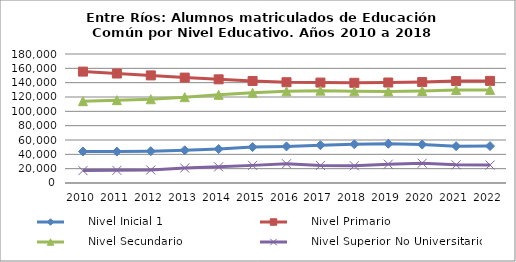
| Category |      Nivel Inicial 1 |      Nivel Primario |      Nivel Secundario |      Nivel Superior No Universitario |
|---|---|---|---|---|
| 2010.0 | 43949 | 155439 | 114175 | 17275 |
| 2011.0 | 43796 | 152764 | 115596 | 17632 |
| 2012.0 | 44383 | 150139 | 116875 | 18198 |
| 2013.0 | 45649 | 147063 | 119798 | 20851 |
| 2014.0 | 47401 | 144671 | 123012 | 22517 |
| 2015.0 | 50105 | 142357 | 125911 | 24594 |
| 2016.0 | 51026 | 140615 | 127937 | 26857 |
| 2017.0 | 52737 | 140117 | 128835 | 24493 |
| 2018.0 | 54021 | 139799 | 127908 | 24008 |
| 2019.0 | 54731 | 140196 | 127823 | 26256 |
| 2020.0 | 53686 | 140841 | 128381 | 27578 |
| 2021.0 | 51402 | 142286 | 129883 | 25354 |
| 2022.0 | 51527 | 142480 | 129903 | 25058 |